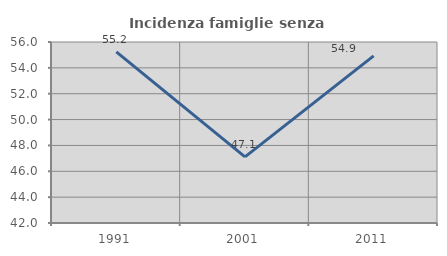
| Category | Incidenza famiglie senza nuclei |
|---|---|
| 1991.0 | 55.23 |
| 2001.0 | 47.115 |
| 2011.0 | 54.922 |